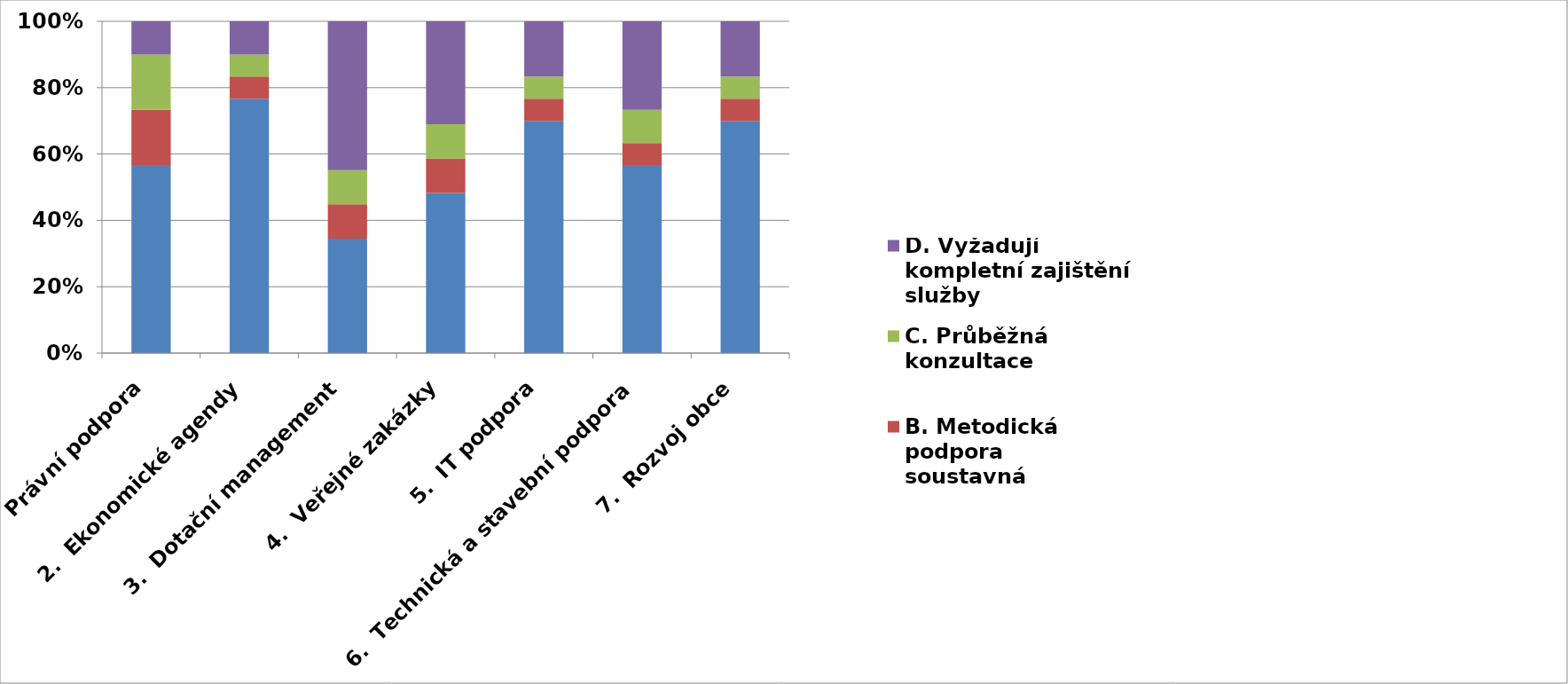
| Category | A. Metodická podpora    jednorázová (Zajišťují si sami) | B. Metodická podpora          soustavná | C. Průběžná konzultace | D. Vyžadují kompletní zajištění služby |
|---|---|---|---|---|
| 1.   Právní podpora | 17 | 5 | 5 | 3 |
| 2.  Ekonomické agendy | 23 | 2 | 2 | 3 |
| 3.  Dotační management | 10 | 3 | 3 | 13 |
| 4.  Veřejné zakázky | 14 | 3 | 3 | 9 |
| 5.  IT podpora | 21 | 2 | 2 | 5 |
| 6.  Technická a stavební podpora | 17 | 2 | 3 | 8 |
| 7.  Rozvoj obce | 21 | 2 | 2 | 5 |